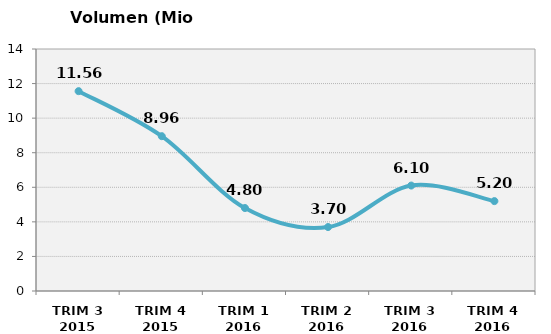
| Category | Volumen (Mio consumiciones) |
|---|---|
| TRIM 3 2015 | 11.561 |
| TRIM 4 2015 | 8.956 |
| TRIM 1 2016 | 4.8 |
| TRIM 2 2016 | 3.7 |
| TRIM 3 2016 | 6.1 |
| TRIM 4 2016 | 5.2 |